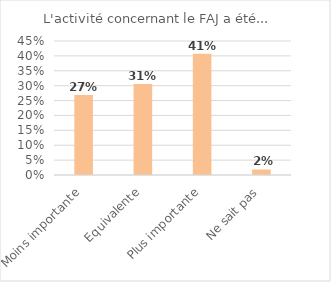
| Category | Series 0 |
|---|---|
| Moins importante | 0.269 |
| Equivalente | 0.306 |
| Plus importante | 0.407 |
| Ne sait pas | 0.019 |